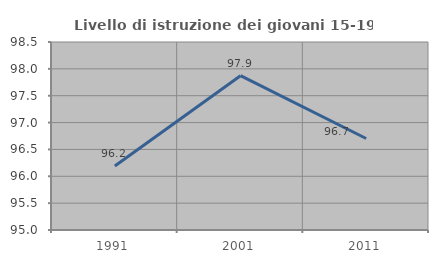
| Category | Livello di istruzione dei giovani 15-19 anni |
|---|---|
| 1991.0 | 96.19 |
| 2001.0 | 97.872 |
| 2011.0 | 96.703 |